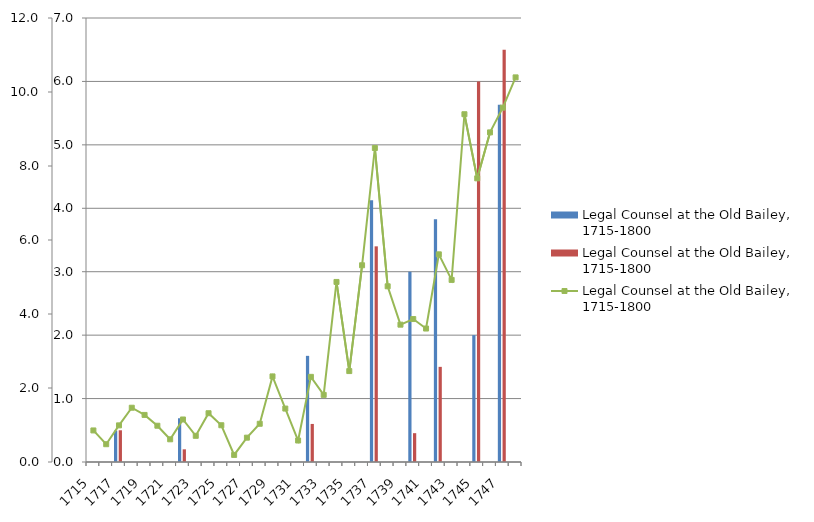
| Category | Legal Counsel at the Old Bailey, 1715-1800 |
|---|---|
| 1715 | 0 |
| 1716 | 0 |
| 1717 | 0.5 |
| 1718 | 0 |
| 1719 | 0 |
| 1720 | 0 |
| 1721 | 0 |
| 1722 | 0.2 |
| 1723 | 0 |
| 1724 | 0 |
| 1725 | 0 |
| 1726 | 0 |
| 1727 | 0 |
| 1728 | 0 |
| 1729 | 0 |
| 1730 | 0 |
| 1731 | 0 |
| 1732 | 0.6 |
| 1733 | 0 |
| 1734 | 0 |
| 1735 | 0 |
| 1736 | 0 |
| 1737 | 3.4 |
| 1738 | 0 |
| 1739 | 0 |
| 1740 | 0.455 |
| 1741 | 0 |
| 1742 | 1.5 |
| 1743 | 0 |
| 1744 | 0 |
| 1745 | 6 |
| 1746 | 0 |
| 1747 | 6.5 |
| 1748 | 0 |